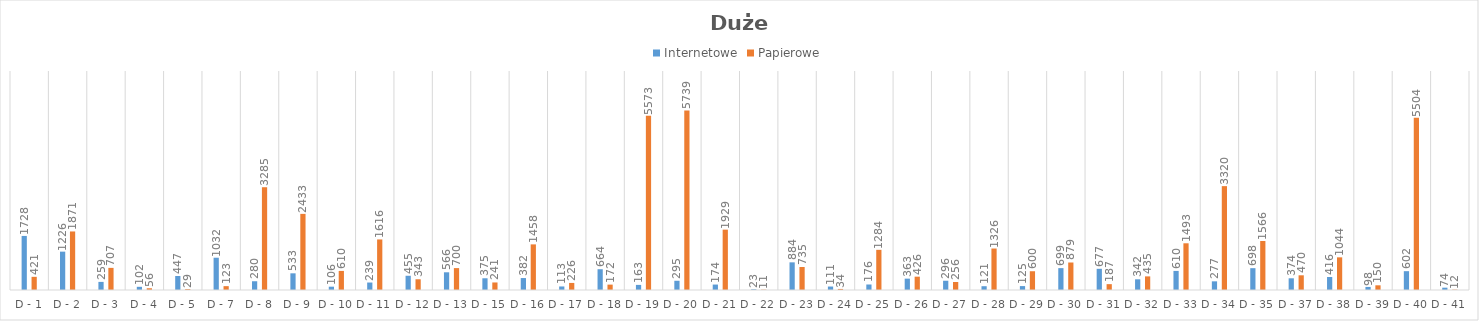
| Category | Internetowe | Papierowe |
|---|---|---|
| D - 1 | 1728 | 421 |
| D - 2 | 1226 | 1871 |
| D - 3 | 259 | 707 |
| D - 4 | 102 | 56 |
| D - 5 | 447 | 29 |
| D - 7 | 1032 | 123 |
| D - 8 | 280 | 3285 |
| D - 9 | 533 | 2433 |
| D - 10 | 106 | 610 |
| D - 11 | 239 | 1616 |
| D - 12 | 455 | 343 |
| D - 13 | 566 | 700 |
| D - 15 | 375 | 241 |
| D - 16 | 382 | 1458 |
| D - 17 | 113 | 226 |
| D - 18 | 664 | 172 |
| D - 19 | 163 | 5573 |
| D - 20 | 295 | 5739 |
| D - 21 | 174 | 1929 |
| D - 22 | 23 | 11 |
| D - 23 | 884 | 735 |
| D - 24 | 111 | 34 |
| D - 25 | 176 | 1284 |
| D - 26 | 363 | 426 |
| D - 27 | 296 | 256 |
| D - 28 | 121 | 1326 |
| D - 29 | 125 | 600 |
| D - 30 | 699 | 879 |
| D - 31 | 677 | 187 |
| D - 32 | 342 | 435 |
| D - 33 | 610 | 1493 |
| D - 34 | 277 | 3320 |
| D - 35 | 698 | 1566 |
| D - 37 | 374 | 470 |
| D - 38 | 416 | 1044 |
| D - 39 | 98 | 150 |
| D - 40 | 602 | 5504 |
| D - 41 | 74 | 12 |